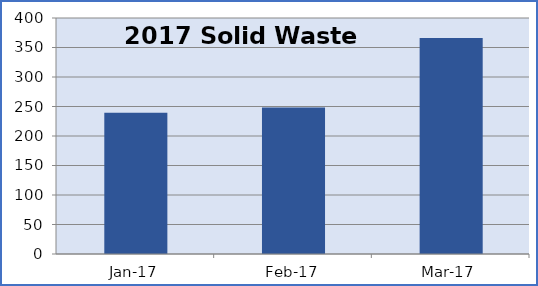
| Category | Series 0 |
|---|---|
| 2017-01-01 | 239.46 |
| 2017-02-01 | 248.23 |
| 2017-03-01 | 366.21 |